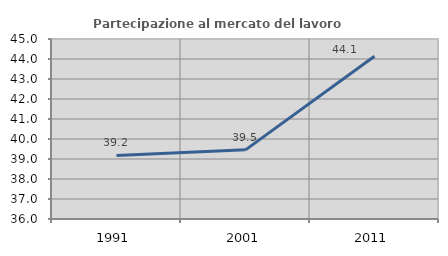
| Category | Partecipazione al mercato del lavoro  femminile |
|---|---|
| 1991.0 | 39.181 |
| 2001.0 | 39.457 |
| 2011.0 | 44.133 |